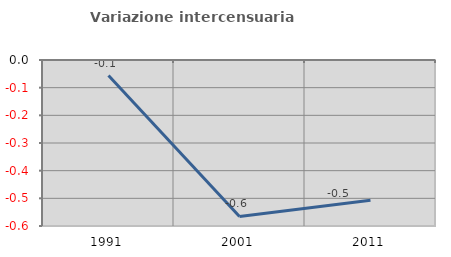
| Category | Variazione intercensuaria annua |
|---|---|
| 1991.0 | -0.056 |
| 2001.0 | -0.565 |
| 2011.0 | -0.507 |